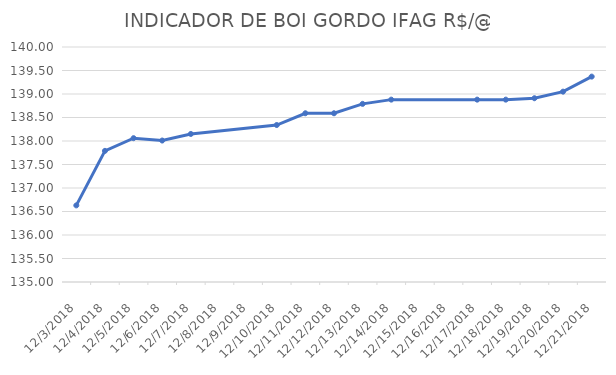
| Category | INDICADOR DE BOI GORDO IFAG |
|---|---|
| 12/3/18 | 136.63 |
| 12/4/18 | 137.79 |
| 12/5/18 | 138.06 |
| 12/6/18 | 138.01 |
| 12/7/18 | 138.15 |
| 12/10/18 | 138.34 |
| 12/11/18 | 138.59 |
| 12/12/18 | 138.59 |
| 12/13/18 | 138.79 |
| 12/14/18 | 138.88 |
| 12/17/18 | 138.88 |
| 12/18/18 | 138.88 |
| 12/19/18 | 138.91 |
| 12/20/18 | 139.05 |
| 12/21/18 | 139.37 |